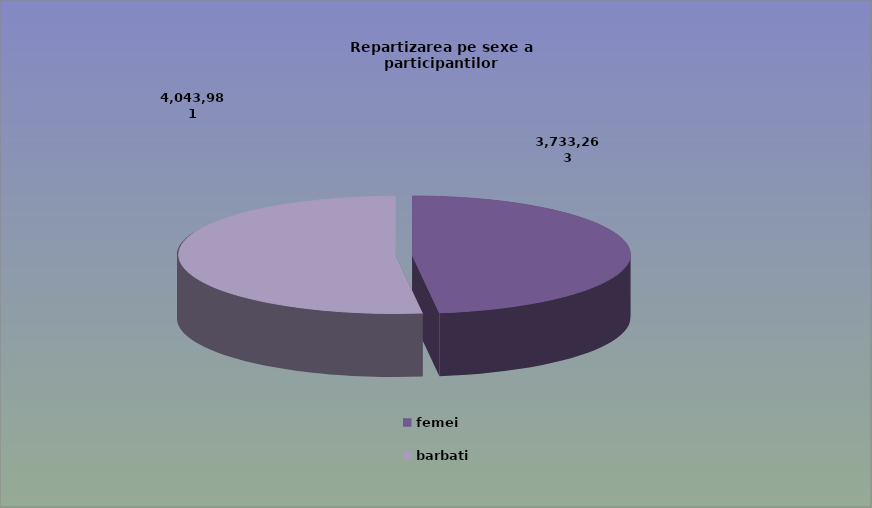
| Category | Series 0 |
|---|---|
| femei | 3733263 |
| barbati | 4043981 |